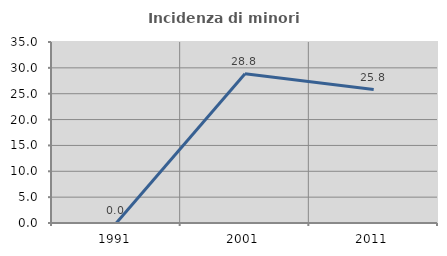
| Category | Incidenza di minori stranieri |
|---|---|
| 1991.0 | 0 |
| 2001.0 | 28.846 |
| 2011.0 | 25.806 |